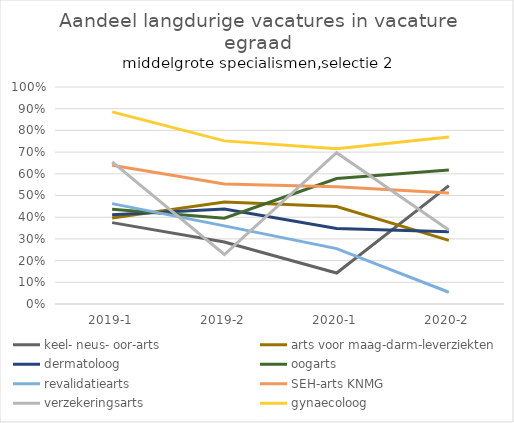
| Category | keel- neus- oor-arts | arts voor maag-darm-leverziekten | dermatoloog | oogarts | revalidatiearts | SEH-arts KNMG | verzekeringsarts | gynaecoloog |
|---|---|---|---|---|---|---|---|---|
| 2019-1 | 0.375 | 0.396 | 0.412 | 0.437 | 0.463 | 0.64 | 0.655 | 0.885 |
| 2019-2 | 0.286 | 0.47 | 0.437 | 0.395 | 0.36 | 0.553 | 0.228 | 0.752 |
| 2020-1 | 0.143 | 0.449 | 0.348 | 0.578 | 0.255 | 0.541 | 0.697 | 0.716 |
| 2020-2 | 0.545 | 0.293 | 0.333 | 0.618 | 0.054 | 0.511 | 0.341 | 0.77 |